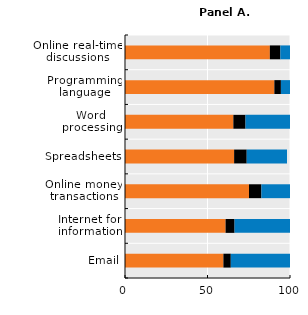
| Category | Never | Less than once a week | At least once a week |
|---|---|---|---|
| Email | 59.64 | 4.481 | 35.879 |
| Internet for information | 60.959 | 5.442 | 33.599 |
| Online money transactions | 75.149 | 7.518 | 17.333 |
| Spreadsheets | 66.135 | 7.633 | 24.414 |
| Word processing | 65.669 | 7.376 | 26.955 |
| Programming language | 90.517 | 3.972 | 5.511 |
| Online real-time discussions | 87.793 | 6.364 | 5.844 |